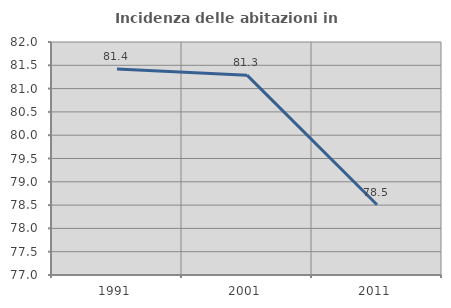
| Category | Incidenza delle abitazioni in proprietà  |
|---|---|
| 1991.0 | 81.42 |
| 2001.0 | 81.288 |
| 2011.0 | 78.507 |